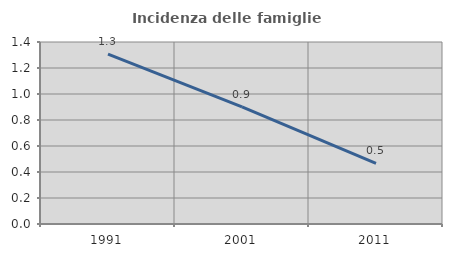
| Category | Incidenza delle famiglie numerose |
|---|---|
| 1991.0 | 1.307 |
| 2001.0 | 0.901 |
| 2011.0 | 0.467 |